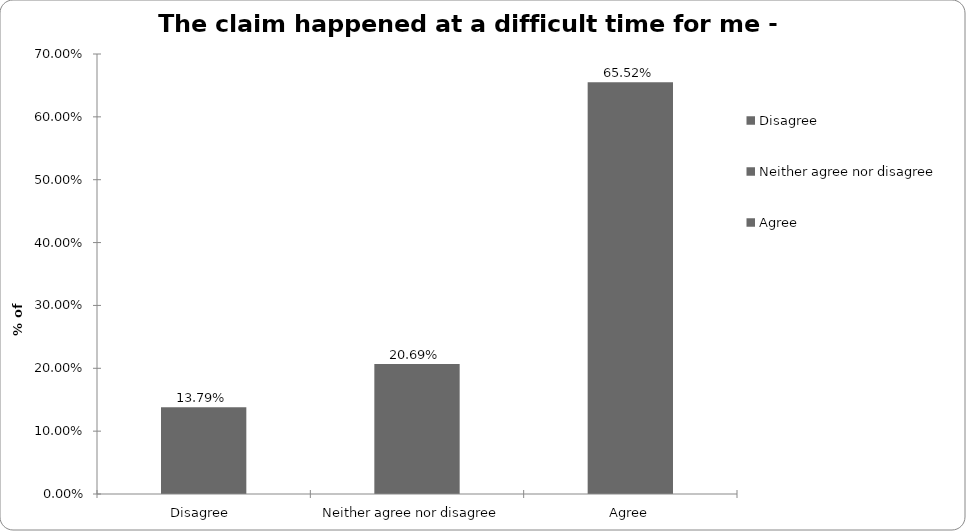
| Category | Motor |
|---|---|
| Disagree  | 0.138 |
| Neither agree nor disagree  | 0.207 |
| Agree | 0.655 |